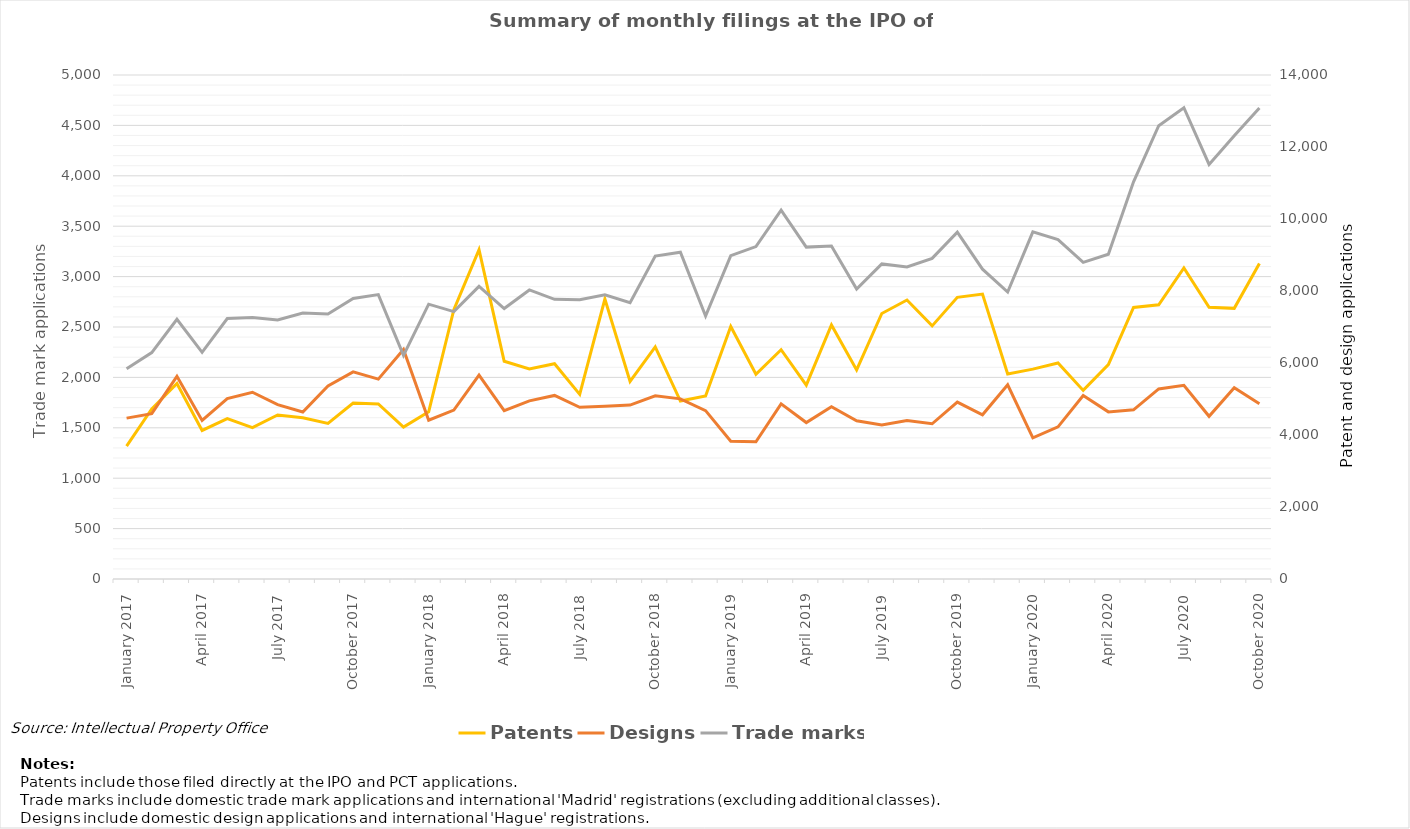
| Category | Patents | Designs |
|---|---|---|
| January 2017 | 1318 | 1596 |
| February 2017 | 1687 | 1640 |
| March 2017 | 1940 | 2011 |
| April 2017 | 1474 | 1573 |
| May 2017 | 1592 | 1790 |
| June 2017 | 1502 | 1853 |
| July 2017 | 1627 | 1730 |
| August 2017 | 1600 | 1657 |
| September 2017 | 1544 | 1915 |
| October 2017 | 1745 | 2055 |
| November 2017 | 1736 | 1983 |
| December 2017 | 1507 | 2277 |
| January 2018 | 1658 | 1575 |
| February 2018 | 2672 | 1676 |
| March 2018 | 3267 | 2022 |
| April 2018 | 2160 | 1670 |
| May 2018 | 2083 | 1767 |
| June 2018 | 2136 | 1821 |
| July 2018 | 1832 | 1704 |
| August 2018 | 2777 | 1713 |
| September 2018 | 1960 | 1725 |
| October 2018 | 2302 | 1818 |
| November 2018 | 1765 | 1787 |
| December 2018 | 1815 | 1670 |
| January 2019 | 2505 | 1367 |
| February 2019 | 2031 | 1361 |
| March 2019 | 2275 | 1737 |
| April 2019 | 1923 | 1552 |
| May 2019 | 2520 | 1710 |
| June 2019 | 2074 | 1570 |
| July 2019 | 2634 | 1527 |
| August 2019 | 2768 | 1572 |
| September 2019 | 2511 | 1540 |
| October 2019 | 2794 | 1755 |
| November 2019 | 2827 | 1629 |
| December 2019 | 2034 | 1927 |
| January 2020 | 2082 | 1400 |
| February 2020 | 2143 | 1509 |
| March 2020 | 1871 | 1820 |
| April 2020 | 2127 | 1658 |
| May 2020 | 2694 | 1678 |
| June 2020 | 2721 | 1886 |
| July 2020 | 3086 | 1921 |
| August 2020 | 2695 | 1614 |
| September 2020 | 2685 | 1898 |
| October 2020 | 3130 | 1738 |